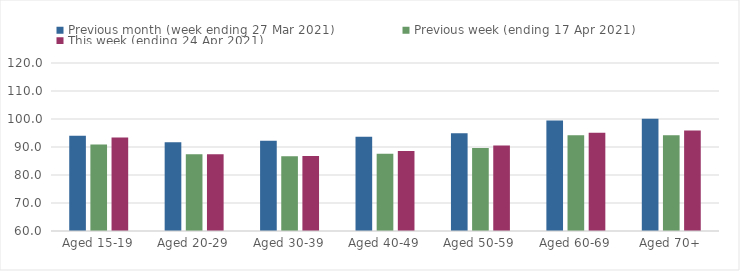
| Category | Previous month (week ending 27 Mar 2021) | Previous week (ending 17 Apr 2021) | This week (ending 24 Apr 2021) |
|---|---|---|---|
| Aged 15-19 | 94.02 | 90.93 | 93.4 |
| Aged 20-29 | 91.68 | 87.41 | 87.38 |
| Aged 30-39 | 92.27 | 86.66 | 86.8 |
| Aged 40-49 | 93.62 | 87.57 | 88.55 |
| Aged 50-59 | 94.93 | 89.62 | 90.58 |
| Aged 60-69 | 99.42 | 94.22 | 95.11 |
| Aged 70+ | 100.05 | 94.16 | 95.86 |